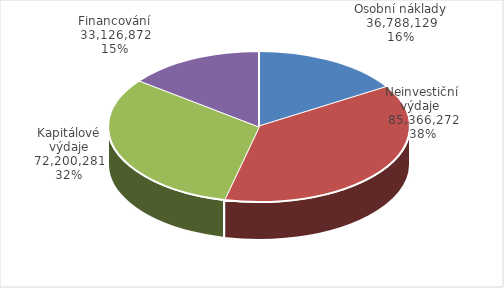
| Category | Series 0 |
|---|---|
| Osobní náklady | 36788129.291 |
| Neinvestiční výdaje  | 85366271.924 |
| Kapitálové výdaje | 72200281 |
| Financování | 33126871.785 |